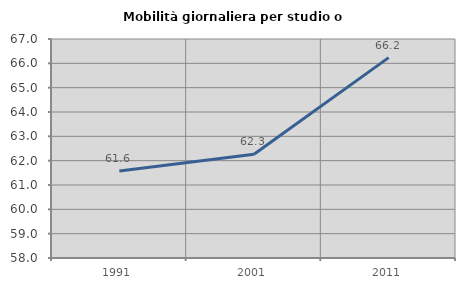
| Category | Mobilità giornaliera per studio o lavoro |
|---|---|
| 1991.0 | 61.571 |
| 2001.0 | 62.266 |
| 2011.0 | 66.235 |